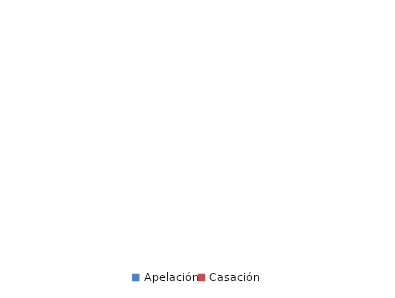
| Category | Series 0 |
|---|---|
| Apelación | 0 |
| Casación | 0 |